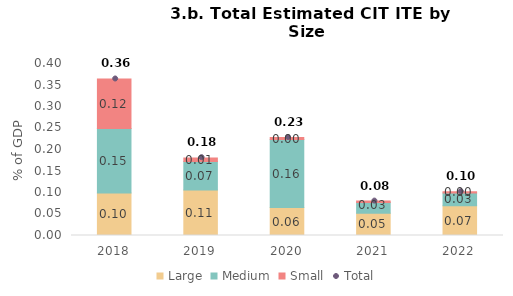
| Category | Large | Medium | Small |
|---|---|---|---|
| 2018.0 | 0.099 | 0.15 | 0.115 |
| 2019.0 | 0.106 | 0.066 | 0.008 |
| 2020.0 | 0.065 | 0.158 | 0.005 |
| 2021.0 | 0.052 | 0.025 | 0.003 |
| 2022.0 | 0.069 | 0.03 | 0.003 |